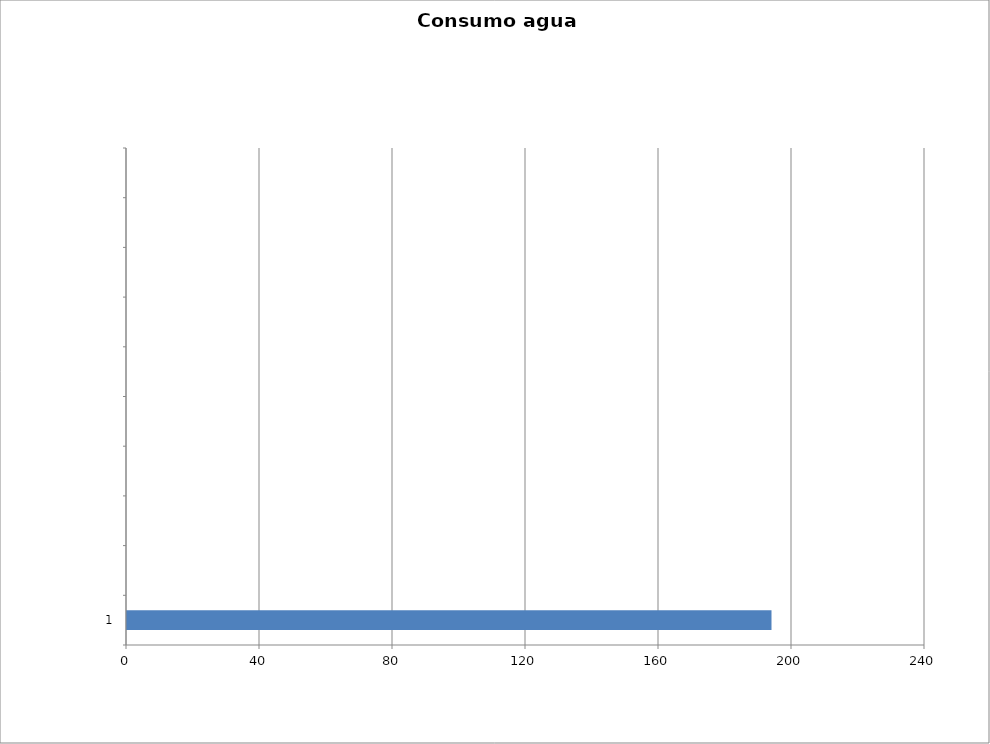
| Category | Series 0 |
|---|---|
| 1 | 193.833 |